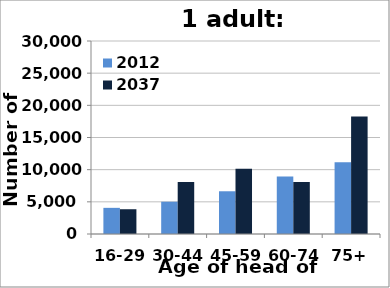
| Category | 2012 | 2037 |
|---|---|---|
| 16-29 | 4065 | 3850 |
| 30-44 | 5019 | 8100 |
| 45-59 | 6642 | 10134 |
| 60-74 | 8949 | 8076 |
| 75+ | 11137 | 18253 |